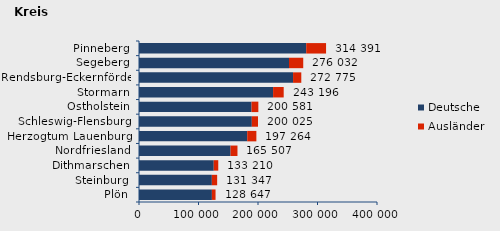
| Category | Deutsche | Ausländer | Series 2 |
|---|---|---|---|
| Plön | 122524 | 6123 | 128647 |
| Steinburg | 122439 | 8908 | 131347 |
| Dithmarschen | 125613 | 7597 | 133210 |
| Nordfriesland | 153879 | 11628 | 165507 |
| Herzogtum Lauenburg | 181865 | 15399 | 197264 |
| Schleswig-Flensburg | 189612 | 10413 | 200025 |
| Ostholstein | 189154 | 11427 | 200581 |
| Stormarn | 225355 | 17841 | 243196 |
| Rendsburg-Eckernförde | 258920 | 13855 | 272775 |
| Segeberg | 252104 | 23928 | 276032 |
| Pinneberg | 281021 | 33370 | 314391 |